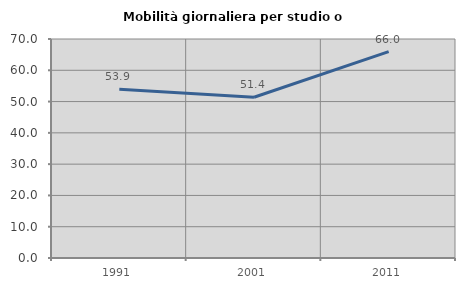
| Category | Mobilità giornaliera per studio o lavoro |
|---|---|
| 1991.0 | 53.917 |
| 2001.0 | 51.373 |
| 2011.0 | 65.965 |